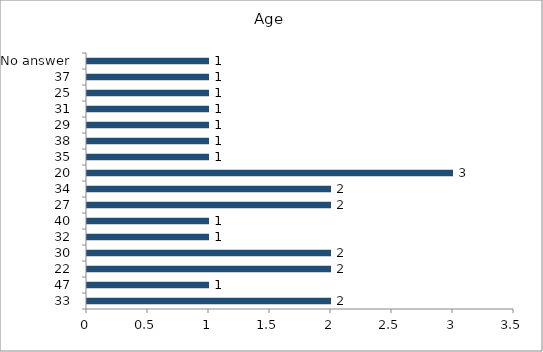
| Category | Age |
|---|---|
| 33 | 2 |
| 47 | 1 |
| 22 | 2 |
| 30 | 2 |
| 32 | 1 |
| 40 | 1 |
| 27 | 2 |
| 34 | 2 |
| 20 | 3 |
| 35 | 1 |
| 38 | 1 |
| 29 | 1 |
| 31 | 1 |
| 25 | 1 |
| 37 | 1 |
| No answer | 1 |